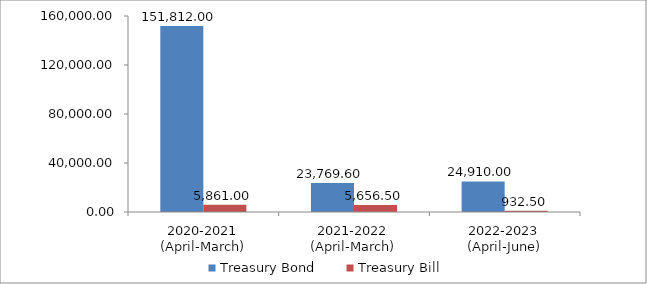
| Category | Treasury Bond | Treasury Bill |
|---|---|---|
| 2020-2021
(April-March) | 151812 | 5861 |
| 2021-2022
(April-March) | 23769.6 | 5656.5 |
| 2022-2023
(April-June) | 24910 | 932.5 |